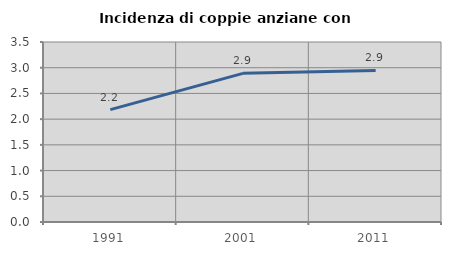
| Category | Incidenza di coppie anziane con figli |
|---|---|
| 1991.0 | 2.185 |
| 2001.0 | 2.891 |
| 2011.0 | 2.946 |